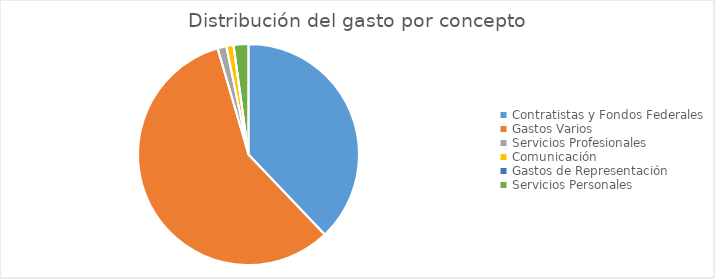
| Category | Series 0 |
|---|---|
| Contratistas y Fondos Federales | 219767324.33 |
| Gastos Varios | 334242351.92 |
| Servicios Profesionales | 7463869.35 |
| Comunicación | 6072935.18 |
| Gastos de Representación | 7041.59 |
| Servicios Personales | 12600613.09 |